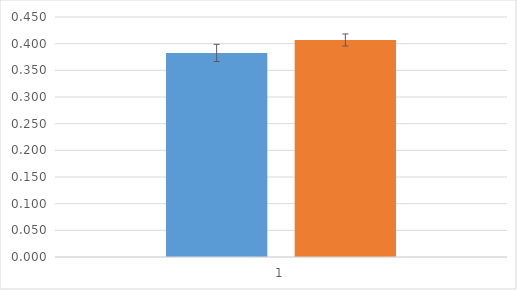
| Category | control | PKD3tg |
|---|---|---|
| 0 | 0.383 | 0.407 |